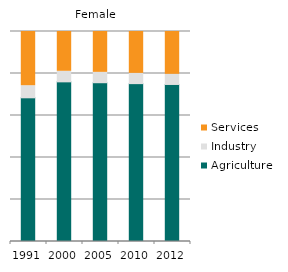
| Category | Agriculture | Industry | Services |
|---|---|---|---|
| 1991.0 | 68.426 | 5.761 | 25.813 |
| 2000.0 | 76.024 | 5.026 | 18.95 |
| 2005.0 | 75.608 | 4.938 | 19.453 |
| 2010.0 | 75.176 | 4.88 | 19.944 |
| 2012.0 | 74.778 | 4.828 | 20.394 |